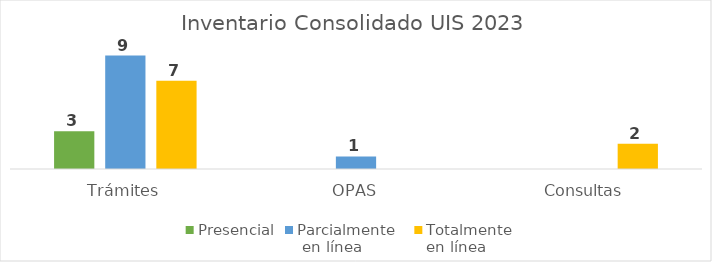
| Category | Presencial | Parcialmente
 en línea | Totalmente
en línea |
|---|---|---|---|
| Trámites | 3 | 9 | 7 |
| OPAS | 0 | 1 | 0 |
| Consultas | 0 | 0 | 2 |